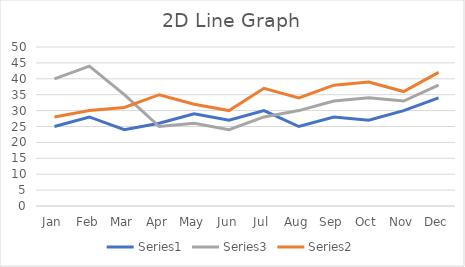
| Category | Series 0 | Series 2 | Series2 |
|---|---|---|---|
| Jan | 25 | 40 | 28 |
| Feb | 28 | 44 | 30 |
| Mar | 24 | 35 | 31 |
| Apr | 26 | 25 | 35 |
| May | 29 | 26 | 32 |
| Jun | 27 | 24 | 30 |
| Jul | 30 | 28 | 37 |
| Aug | 25 | 30 | 34 |
| Sep | 28 | 33 | 38 |
| Oct | 27 | 34 | 39 |
| Nov | 30 | 33 | 36 |
| Dec | 34 | 38 | 42 |